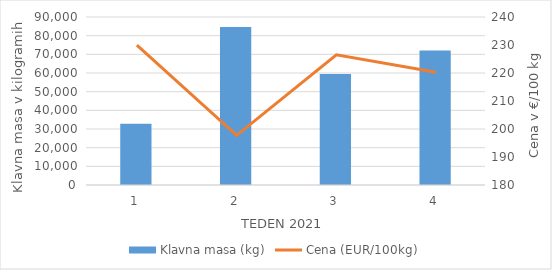
| Category | Klavna masa (kg) |
|---|---|
| 1.0 | 32871 |
| 2.0 | 84639 |
| 3.0 | 59476 |
| 4.0 | 72013 |